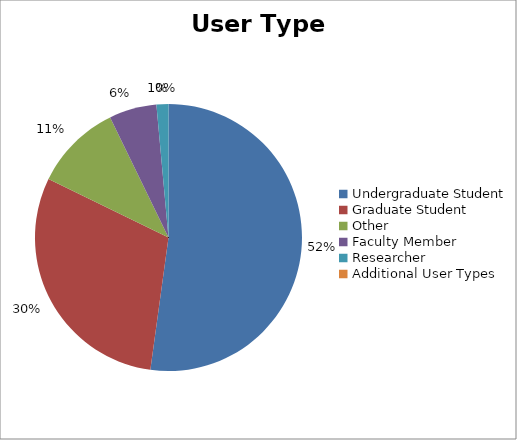
| Category | Series 0 |
|---|---|
| Undergraduate Student | 1695 |
| Graduate Student | 976 |
| Other | 344 |
| Faculty Member | 187 |
| Researcher | 47 |
| Additional User Types | 0 |